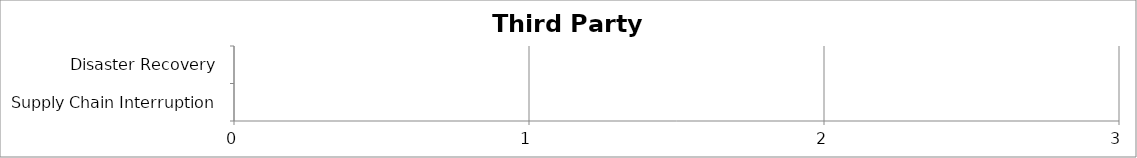
| Category | Low | Medium | High |
|---|---|---|---|
| Supply Chain Interruption | 0 | 0 | 0 |
| Disaster Recovery | 0 | 0 | 0 |